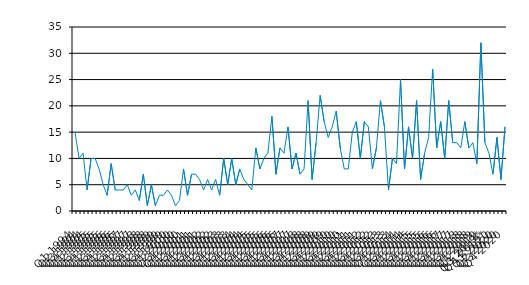
| Category | Series 0 |
|---|---|
| Q1 1994 | 15 |
| Q2 1994 | 10 |
| Q3 1994 | 11 |
| Q4 1994 | 4 |
| Q1 1995 | 10 |
| Q2 1995 | 10 |
| Q3 1995 | 8 |
| Q4 1995 | 5 |
| Q1 1996 | 3 |
| Q2 1996 | 9 |
| Q3 1996 | 4 |
| Q4 1996 | 4 |
| Q1 1997 | 4 |
| Q2 1997 | 5 |
| Q3 1997 | 3 |
| Q4 1997 | 4 |
| Q1 1998 | 2 |
| Q2 1998 | 7 |
| Q3 1998 | 1 |
| Q4 1998 | 5 |
| Q1 1999 | 1 |
| Q2 1999 | 3 |
| Q3 1999 | 3 |
| Q4 1999 | 4 |
| Q1 2000 | 3 |
| Q2 2000 | 1 |
| Q3 2000 | 2 |
| Q4 2000 | 8 |
| Q1 2001 | 3 |
| Q2 2001 | 7 |
| Q3 2001 | 7 |
| Q4 2001 | 6 |
| Q1 2002 | 4 |
| Q2 2002 | 6 |
| Q3 2002 | 4 |
| Q4 2002 | 6 |
| Q1 2003 | 3 |
| Q2 2003 | 10 |
| Q3 2003 | 5 |
| Q4 2003 | 10 |
| Q1 2004 | 5 |
| Q2 2004 | 8 |
| Q3 2004 | 6 |
| Q4 2004 | 5 |
| Q1 2005 | 4 |
| Q2 2005 | 12 |
| Q3 2005 | 8 |
| Q4 2005 | 10 |
| Q1 2006 | 11 |
| Q2 2006 | 18 |
| Q3 2006 | 7 |
| Q4 2006 | 12 |
| Q1 2007 | 11 |
| Q2 2007 | 16 |
| Q3 2007 | 8 |
| Q4 2007 | 11 |
| Q1 2008 | 7 |
| Q2 2008 | 8 |
| Q3 2008 | 21 |
| Q4 2008 | 6 |
| Q1 2009 | 13 |
| Q2 2009 | 22 |
| Q3 2009 | 17 |
| Q4 2009 | 14 |
| Q1 2010 | 16 |
| Q2 2010 | 19 |
| Q3 2010 | 12 |
| Q4 2010 | 8 |
| Q1 2011 | 8 |
| Q2 2011 | 15 |
| Q3 2011 | 17 |
| Q4 2011 | 10 |
| Q1 2012 | 17 |
| Q2 2012 | 16 |
| Q3 2012 | 8 |
| Q4 2012 | 12 |
| Q1 2013 | 21 |
| Q2 2013 | 16 |
| Q3 2013 | 4 |
| Q4 2013 | 10 |
| Q1 2014 | 9 |
| Q2 2014 | 25 |
| Q3 2014 | 8 |
| Q4 2014 | 16 |
| Q1 2015 | 10 |
| Q2 2015 | 21 |
| Q3 2015 | 6 |
| Q4 2015 | 11 |
| Q1 2016 | 14 |
| Q2 2016 | 27 |
| Q3 2016 | 12 |
| Q4 2016 | 17 |
| Q1 2017 | 10 |
| Q2 2017 | 21 |
| Q3 2017 | 13 |
| Q4 2017 | 13 |
| Q1 2018 | 12 |
| Q2 2018 | 17 |
| Q3 2018 | 12 |
| Q4 2018 | 13 |
| Q1 2019 | 9 |
| Q2 2019 | 32 |
| Q3 2019* | 13 |
| Q4 2019* | 11 |
| Q1 2020 | 7 |
| Q2 2020 | 14 |
| Q3 2020 | 6 |
| Q4 2020 | 16 |